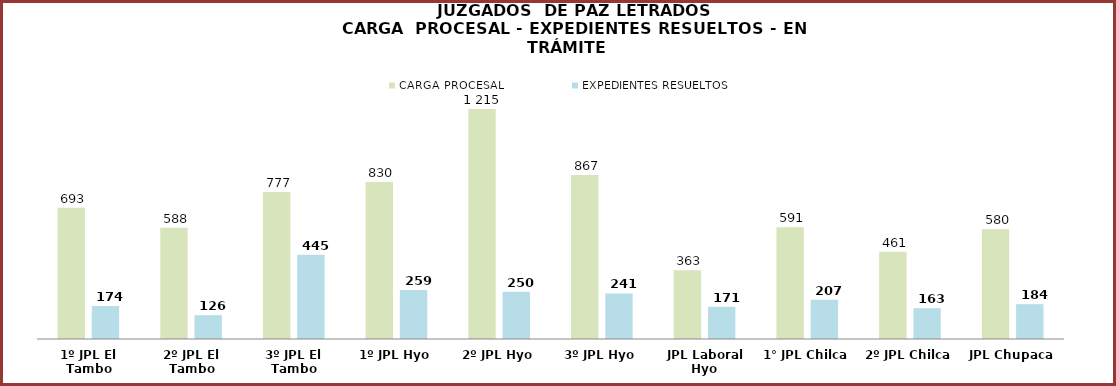
| Category | CARGA PROCESAL | EXPEDIENTES RESUELTOS |
|---|---|---|
| 1º JPL El Tambo | 693 | 174 |
| 2º JPL El Tambo | 588 | 126 |
| 3º JPL El Tambo | 777 | 445 |
| 1º JPL Hyo | 830 | 259 |
| 2º JPL Hyo | 1215 | 250 |
| 3º JPL Hyo | 867 | 241 |
| JPL Laboral Hyo | 363 | 171 |
| 1° JPL Chilca | 591 | 207 |
| 2º JPL Chilca | 461 | 163 |
| JPL Chupaca | 580 | 184 |